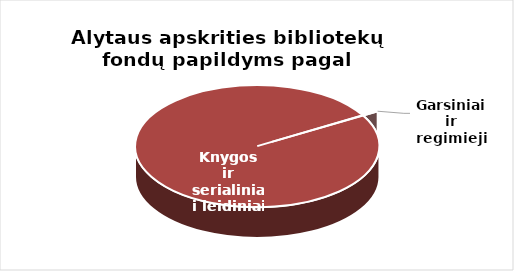
| Category | Series 0 |
|---|---|
| Knygos ir  | 34237 |
| Garsiniai ir regimieji | 23 |